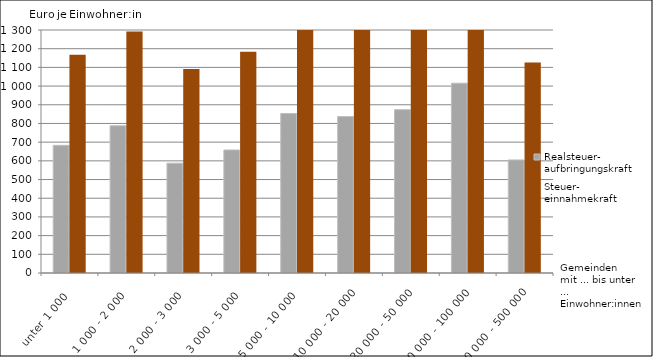
| Category | Realsteuer-
aufbringungskraft  | Steuer-
einnahmekraft  |
|---|---|---|
| unter 1 000 | 682.88 | 1168.24 |
| 1 000 - 2 000 | 787.67 | 1291.49 |
| 2 000 - 3 000 | 587.48 | 1090.98 |
| 3 000 - 5 000 | 658.08 | 1183.55 |
| 5 000 - 10 000 | 853.36 | 1338 |
| 10 000 - 20 000 | 836.79 | 1382.5 |
| 20 000 - 50 000 | 873.75 | 1405.5 |
| 50 000 - 100 000 | 1015.53 | 1524.95 |
| 200 000 - 500 000 | 604.93 | 1126.71 |